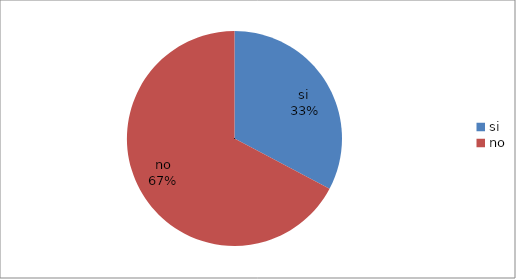
| Category | Series 0 |
|---|---|
| si  | 131 |
| no | 269 |